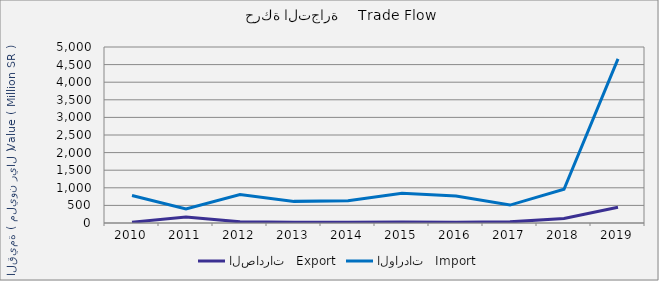
| Category | الصادرات   Export | الواردات   Import |
|---|---|---|
| 2010.0 | 23402271 | 782271385 |
| 2011.0 | 173407361 | 396561414 |
| 2012.0 | 32674732 | 808245974 |
| 2013.0 | 23381383 | 614370751 |
| 2014.0 | 19237580 | 634163018 |
| 2015.0 | 29124429 | 842679997 |
| 2016.0 | 24026471 | 764554030 |
| 2017.0 | 32294897 | 508904660 |
| 2018.0 | 128851136 | 959306780 |
| 2019.0 | 447579922 | 4663523482 |